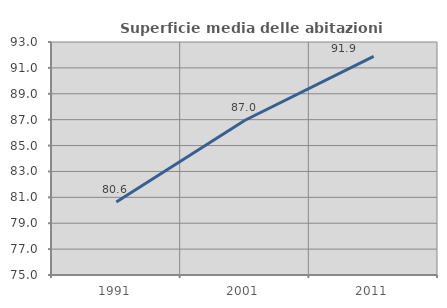
| Category | Superficie media delle abitazioni occupate |
|---|---|
| 1991.0 | 80.64 |
| 2001.0 | 86.953 |
| 2011.0 | 91.884 |